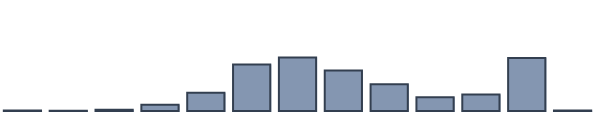
| Category | Series 0 |
|---|---|
| 0 | 0.161 |
| 1 | 0.109 |
| 2 | 0.471 |
| 3 | 2.228 |
| 4 | 6.569 |
| 5 | 16.79 |
| 6 | 19.311 |
| 7 | 14.637 |
| 8 | 9.615 |
| 9 | 4.913 |
| 10 | 5.943 |
| 11 | 19.085 |
| 12 | 0.169 |